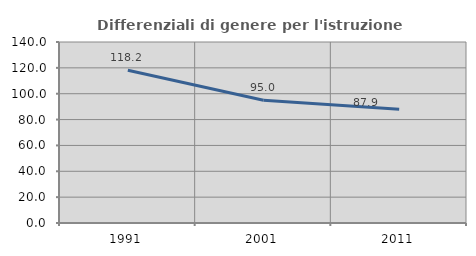
| Category | Differenziali di genere per l'istruzione superiore |
|---|---|
| 1991.0 | 118.216 |
| 2001.0 | 94.958 |
| 2011.0 | 87.944 |